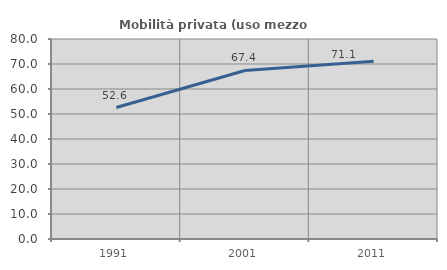
| Category | Mobilità privata (uso mezzo privato) |
|---|---|
| 1991.0 | 52.575 |
| 2001.0 | 67.412 |
| 2011.0 | 71.072 |